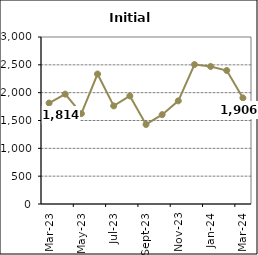
| Category | Series 0 |
|---|---|
| 2023-03-01 | 1814 |
| 2023-04-01 | 1974 |
| 2023-05-01 | 1623 |
| 2023-06-01 | 2335 |
| 2023-07-01 | 1762 |
| 2023-08-01 | 1942 |
| 2023-09-01 | 1429 |
| 2023-10-01 | 1605 |
| 2023-11-01 | 1853 |
| 2023-12-01 | 2505 |
| 2024-01-01 | 2471 |
| 2024-02-01 | 2398 |
| 2024-03-01 | 1906 |